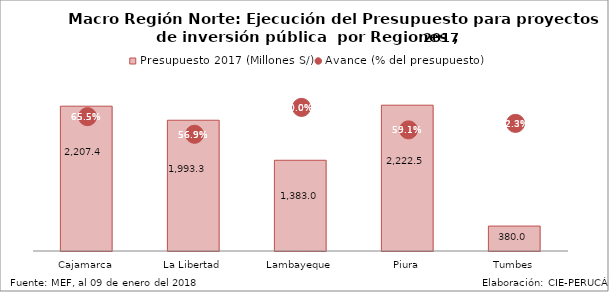
| Category | Presupuesto 2017 (Millones S/) |
|---|---|
| Cajamarca | 2207.415 |
| La Libertad | 1993.288 |
| Lambayeque | 1382.958 |
| Piura | 2222.533 |
| Tumbes | 380.03 |